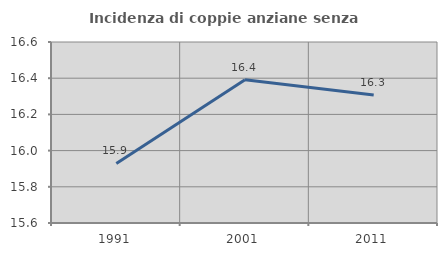
| Category | Incidenza di coppie anziane senza figli  |
|---|---|
| 1991.0 | 15.929 |
| 2001.0 | 16.392 |
| 2011.0 | 16.307 |